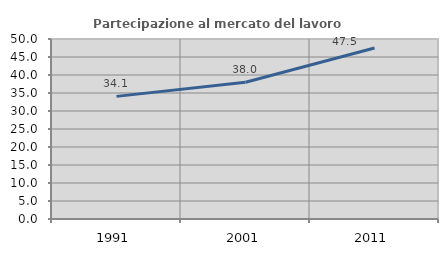
| Category | Partecipazione al mercato del lavoro  femminile |
|---|---|
| 1991.0 | 34.06 |
| 2001.0 | 37.984 |
| 2011.0 | 47.485 |